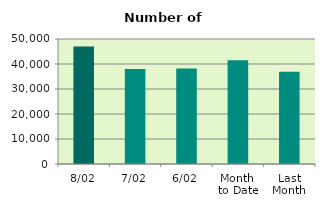
| Category | Series 0 |
|---|---|
| 8/02 | 47030 |
| 7/02 | 38020 |
| 6/02 | 38178 |
| Month 
to Date | 41511.667 |
| Last
Month | 36886.364 |